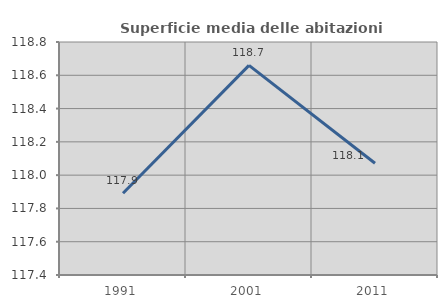
| Category | Superficie media delle abitazioni occupate |
|---|---|
| 1991.0 | 117.891 |
| 2001.0 | 118.66 |
| 2011.0 | 118.071 |